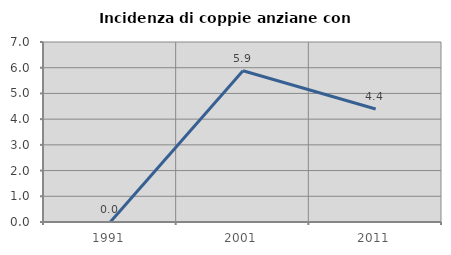
| Category | Incidenza di coppie anziane con figli |
|---|---|
| 1991.0 | 0 |
| 2001.0 | 5.882 |
| 2011.0 | 4.396 |